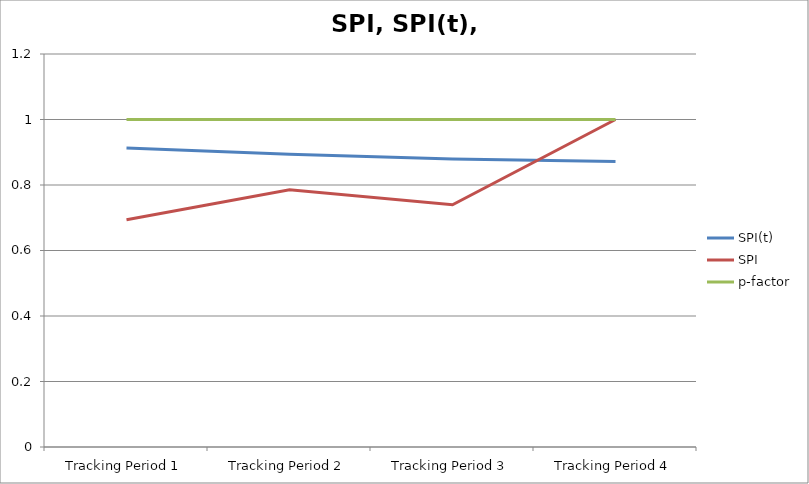
| Category | SPI(t) | SPI | p-factor |
|---|---|---|---|
| Tracking Period 1 | 0.913 | 0.694 | 1 |
| Tracking Period 2 | 0.894 | 0.786 | 1 |
| Tracking Period 3 | 0.879 | 0.74 | 1 |
| Tracking Period 4 | 0.872 | 1 | 1 |